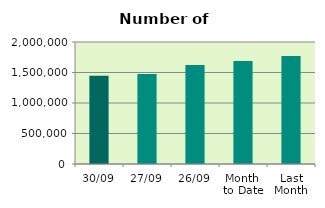
| Category | Series 0 |
|---|---|
| 30/09 | 1446688 |
| 27/09 | 1473568 |
| 26/09 | 1623056 |
| Month 
to Date | 1689477.048 |
| Last
Month | 1768562.909 |